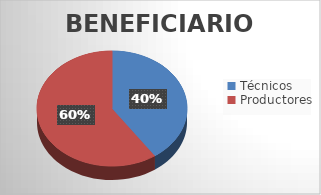
| Category | Series 0 |
|---|---|
| Técnicos | 90 |
| Productores | 133 |